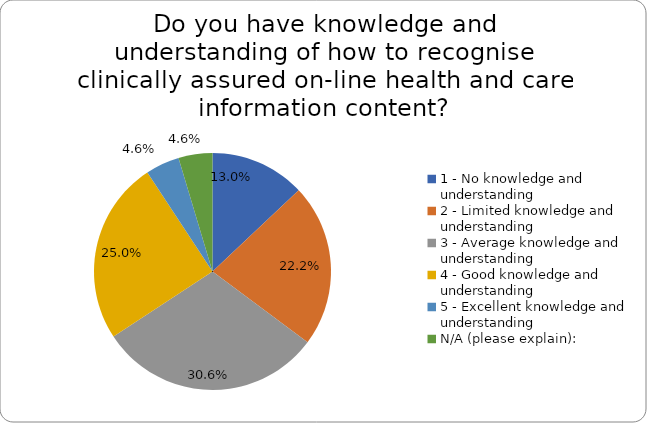
| Category | Series 0 |
|---|---|
| 1 - No knowledge and understanding | 0.13 |
| 2 - Limited knowledge and understanding | 0.222 |
| 3 - Average knowledge and understanding | 0.306 |
| 4 - Good knowledge and understanding | 0.25 |
| 5 - Excellent knowledge and understanding | 0.046 |
| N/A (please explain): | 0.046 |